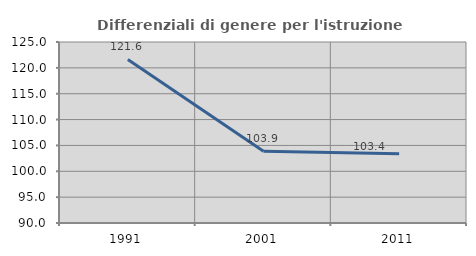
| Category | Differenziali di genere per l'istruzione superiore |
|---|---|
| 1991.0 | 121.624 |
| 2001.0 | 103.867 |
| 2011.0 | 103.398 |